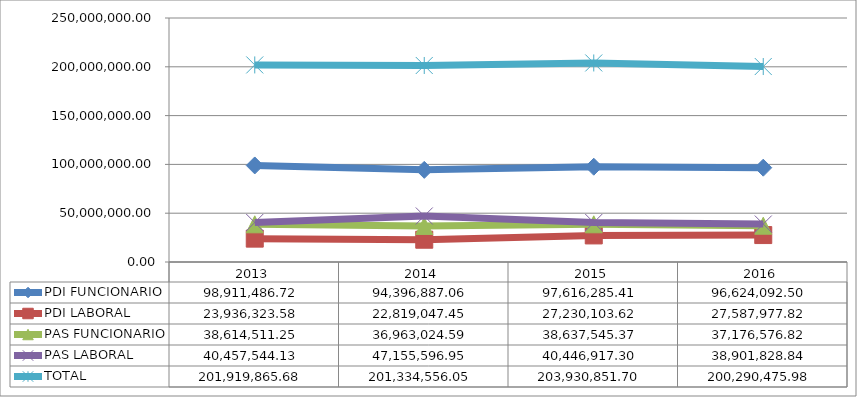
| Category | PDI FUNCIONARIO | PDI LABORAL | PAS FUNCIONARIO | PAS LABORAL | TOTAL |
|---|---|---|---|---|---|
| 2013 | 98911486.72 | 23936323.58 | 38614511.25 | 40457544.13 | 201919865.68 |
| 2014 | 94396887.063 | 22819047.45 | 36963024.586 | 47155596.951 | 201334556.05 |
| 2015 | 97616285.413 | 27230103.621 | 38637545.368 | 40446917.299 | 203930851.7 |
| 2016 | 96624092.5 | 27587977.82 | 37176576.82 | 38901828.84 | 200290475.98 |